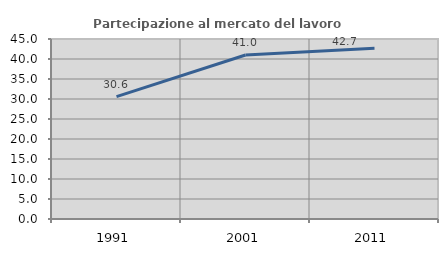
| Category | Partecipazione al mercato del lavoro  femminile |
|---|---|
| 1991.0 | 30.579 |
| 2001.0 | 41.008 |
| 2011.0 | 42.685 |